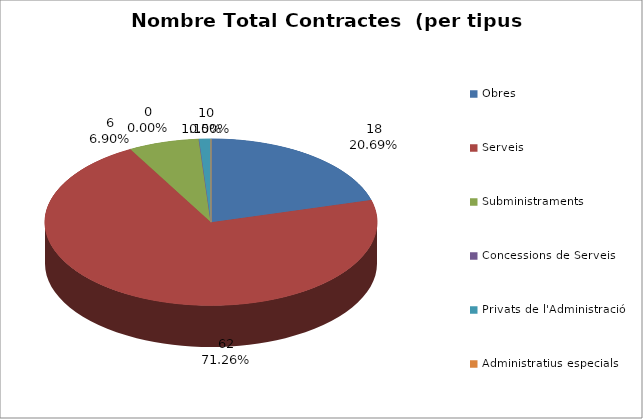
| Category | Nombre Total Contractes |
|---|---|
| Obres | 18 |
| Serveis | 62 |
| Subministraments | 6 |
| Concessions de Serveis | 0 |
| Privats de l'Administració | 1 |
| Administratius especials | 0 |